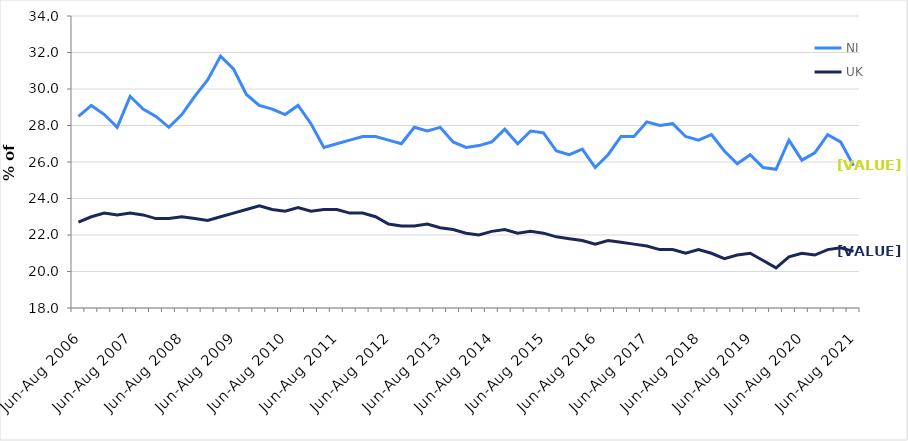
| Category | NI | UK |
|---|---|---|
| Jun-Aug 2006 | 28.5 | 22.7 |
| Sep-Nov 2006 | 29.1 | 23 |
| Dec-Feb 2007 | 28.6 | 23.2 |
| Mar-May 2007 | 27.9 | 23.1 |
| Jun-Aug 2007 | 29.6 | 23.2 |
| Sep-Nov 2007 | 28.9 | 23.1 |
| Dec-Feb 2008 | 28.5 | 22.9 |
| Mar-May 2008 | 27.9 | 22.9 |
| Jun-Aug 2008 | 28.6 | 23 |
| Sep-Nov 2008 | 29.6 | 22.9 |
| Dec-Feb 2009 | 30.5 | 22.8 |
| Mar-May 2009 | 31.8 | 23 |
| Jun-Aug 2009 | 31.1 | 23.2 |
| Sep-Nov 2009 | 29.7 | 23.4 |
| Dec-Feb 2010 | 29.1 | 23.6 |
| Mar-May 2010 | 28.9 | 23.4 |
| Jun-Aug 2010 | 28.6 | 23.3 |
| Sep-Nov 2010 | 29.1 | 23.5 |
| Dec-Feb 2011 | 28.1 | 23.3 |
| Mar-May 2011 | 26.8 | 23.4 |
| Jun-Aug 2011 | 27 | 23.4 |
| Sep-Nov 2011 | 27.2 | 23.2 |
| Dec-Feb 2012 | 27.4 | 23.2 |
| Mar-May 2012 | 27.4 | 23 |
| Jun-Aug 2012 | 27.2 | 22.6 |
| Sep-Nov 2012 | 27 | 22.5 |
| Dec-Feb 2013 | 27.9 | 22.5 |
| Mar-May 2013 | 27.7 | 22.6 |
| Jun-Aug 2013 | 27.9 | 22.4 |
| Sep-Nov 2013 | 27.1 | 22.3 |
| Dec-Feb 2014 | 26.8 | 22.1 |
| Mar-May 2014 | 26.9 | 22 |
| Jun-Aug 2014 | 27.1 | 22.2 |
| Sep-Nov 2014 | 27.8 | 22.3 |
| Dec-Feb 2015 | 27 | 22.1 |
| Mar-May 2015 | 27.7 | 22.2 |
| Jun-Aug 2015 | 27.6 | 22.1 |
| Sep-Nov 2015 | 26.6 | 21.9 |
| Dec-Feb 2016 | 26.4 | 21.8 |
| Mar-May 2016 | 26.7 | 21.7 |
| Jun-Aug 2016 | 25.7 | 21.5 |
| Sep-Nov 2016 | 26.4 | 21.7 |
| Dec-Feb 2017 | 27.4 | 21.6 |
| Mar-May 2017 | 27.4 | 21.5 |
| Jun-Aug 2017 | 28.2 | 21.4 |
| Sep-Nov 2017 | 28 | 21.2 |
| Dec-Feb 2018 | 28.1 | 21.2 |
| Mar-May 2018 | 27.4 | 21 |
| Jun-Aug 2018 | 27.2 | 21.2 |
| Sep-Nov 2018 | 27.5 | 21 |
| Dec-Feb 2019 | 26.6 | 20.7 |
| Mar-May 2019 | 25.9 | 20.9 |
| Jun-Aug 2019 | 26.4 | 21 |
| Sep-Nov 2019 | 25.7 | 20.6 |
| Dec-Feb 2020 | 25.6 | 20.2 |
| Mar-May 2020 | 27.2 | 20.8 |
| Jun-Aug 2020 | 26.1 | 21 |
| Sep-Nov 2020 | 26.5 | 20.9 |
| Dec-Feb 2021 | 27.5 | 21.2 |
| Mar-May 2021 | 27.1 | 21.3 |
| Jun-Aug 2021 | 25.8 | 21.1 |